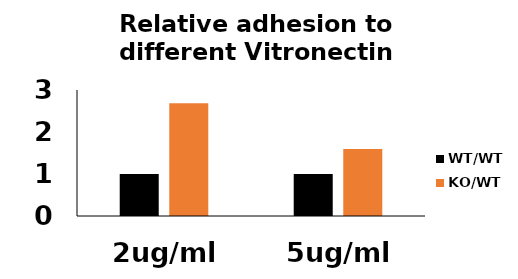
| Category | WT/WT | KO/WT |
|---|---|---|
| 2ug/ml | 1 | 2.684 |
| 5ug/ml | 1 | 1.596 |